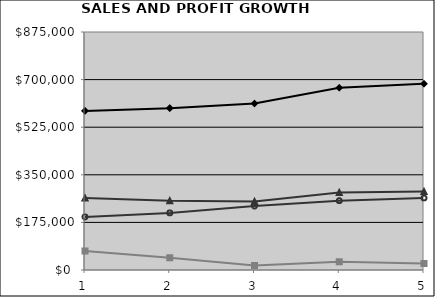
| Category | Sales | Gross Profit - $ | Operating Expenses | Profit - $ |
|---|---|---|---|---|
| 0 | 585000 | 265000 | 195000 | 70000 |
| 1 | 595000 | 255000 | 210000 | 45000 |
| 2 | 612000 | 252000 | 235000 | 17000 |
| 3 | 670000 | 285000 | 255000 | 30000 |
| 4 | 685000 | 289000 | 265000 | 24000 |